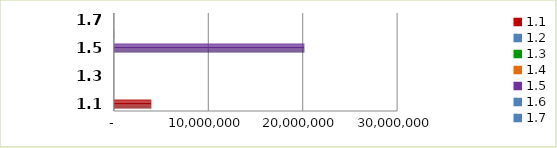
| Category | Series 0 |
|---|---|
| 1.1 | 3967586 |
| 1.2 | 0 |
| 1.3 | 0 |
| 1.4 | 0 |
| 1.5 | 20178631 |
| 1.6 | 31942 |
| 1.7 | 0 |